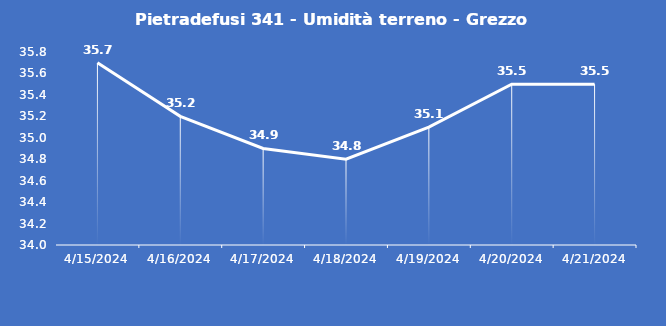
| Category | Pietradefusi 341 - Umidità terreno - Grezzo (%VWC) |
|---|---|
| 4/15/24 | 35.7 |
| 4/16/24 | 35.2 |
| 4/17/24 | 34.9 |
| 4/18/24 | 34.8 |
| 4/19/24 | 35.1 |
| 4/20/24 | 35.5 |
| 4/21/24 | 35.5 |